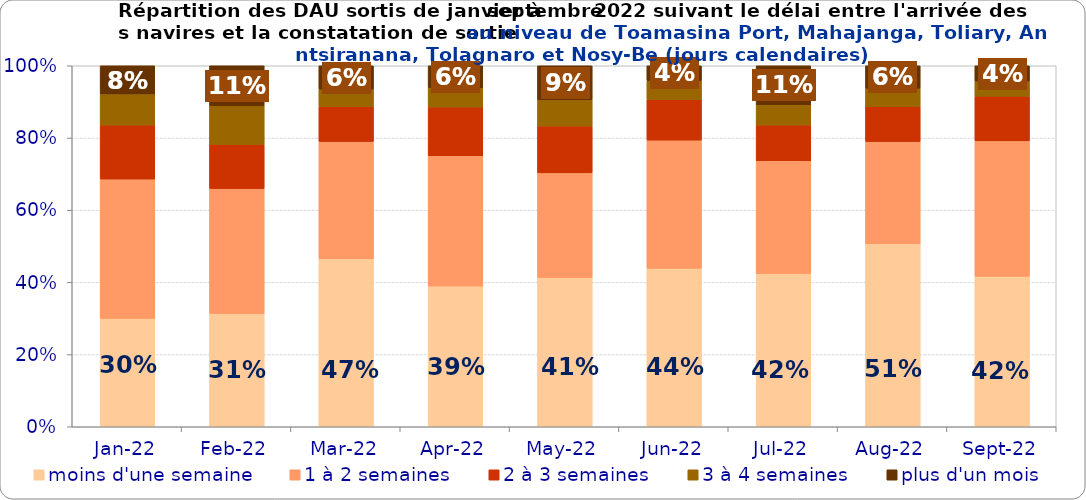
| Category | moins d'une semaine | 1 à 2 semaines | 2 à 3 semaines | 3 à 4 semaines | plus d'un mois |
|---|---|---|---|---|---|
| 2022-01-01 | 0.3 | 0.386 | 0.149 | 0.087 | 0.078 |
| 2022-02-01 | 0.314 | 0.346 | 0.122 | 0.107 | 0.111 |
| 2022-03-01 | 0.465 | 0.325 | 0.097 | 0.048 | 0.065 |
| 2022-04-01 | 0.39 | 0.361 | 0.135 | 0.054 | 0.061 |
| 2022-05-01 | 0.413 | 0.29 | 0.13 | 0.073 | 0.094 |
| 2022-06-01 | 0.439 | 0.355 | 0.112 | 0.053 | 0.041 |
| 2022-07-01 | 0.424 | 0.313 | 0.099 | 0.056 | 0.108 |
| 2022-08-01 | 0.507 | 0.283 | 0.097 | 0.051 | 0.062 |
| 2022-09-01 | 0.417 | 0.375 | 0.124 | 0.042 | 0.042 |